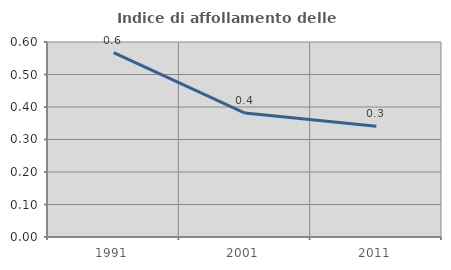
| Category | Indice di affollamento delle abitazioni  |
|---|---|
| 1991.0 | 0.567 |
| 2001.0 | 0.381 |
| 2011.0 | 0.341 |